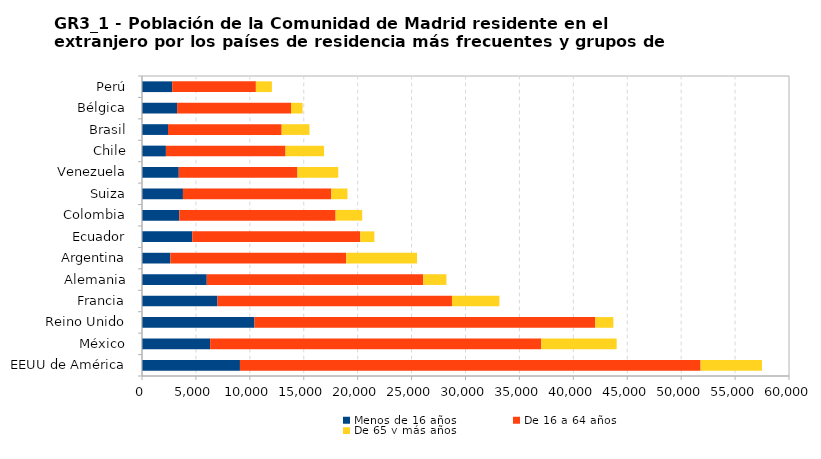
| Category | Menos de 16 años | De 16 a 64 años | De 65 y más años |
|---|---|---|---|
| EEUU de América | 9084 | 42717 | 5697 |
|     México | 6318 | 30710 | 6992 |
|     Reino Unido | 10431 | 31607 | 1673 |
|     Francia | 7001 | 21745 | 4398 |
|     Alemania | 6006 | 20067 | 2159 |
|     Argentina | 2630 | 16311 | 6565 |
|     Ecuador | 4660 | 15583 | 1306 |
|     Colombia | 3461 | 14494 | 2464 |
|     Suiza | 3797 | 13763 | 1493 |
|     Venezuela | 3410 | 11009 | 3780 |
|     Chile | 2218 | 11095 | 3570 |
|     Brasil | 2411 | 10543 | 2579 |
|     Bélgica | 3256 | 10565 | 1070 |
|     Perú | 2798 | 7763 | 1487 |